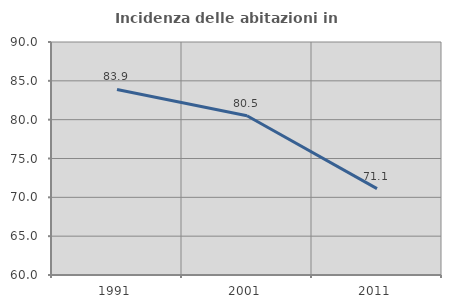
| Category | Incidenza delle abitazioni in proprietà  |
|---|---|
| 1991.0 | 83.894 |
| 2001.0 | 80.513 |
| 2011.0 | 71.125 |